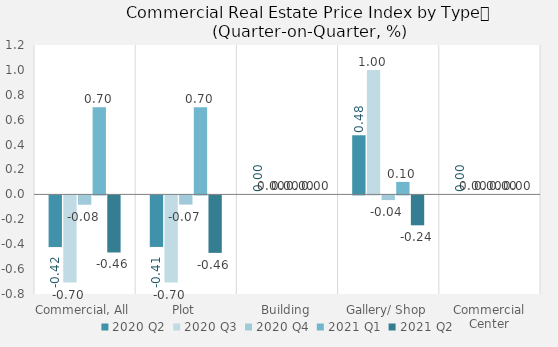
| Category | 2020 | 2021 |
|---|---|---|
| Commercial, All | -0.075 | -0.458 |
| Plot | -0.074 | -0.462 |
| Building | 0 | 0 |
| Gallery/ Shop | -0.038 | -0.24 |
| Commercial Center | 0 | 0 |